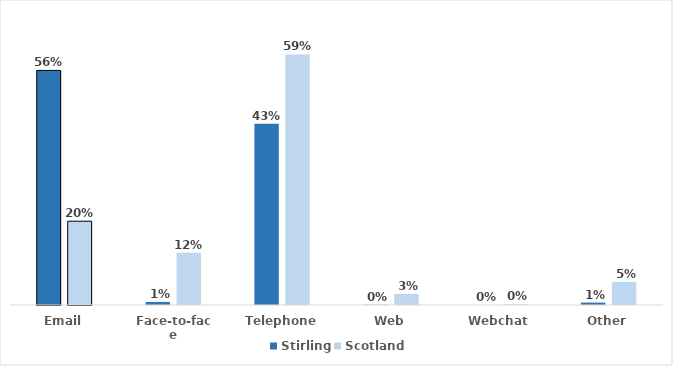
| Category | Stirling | Scotland |
|---|---|---|
| Email | 0.557 | 0.199 |
| Face-to-face | 0.007 | 0.124 |
| Telephone | 0.43 | 0.595 |
| Web | 0.001 | 0.026 |
| Webchat | 0 | 0.002 |
| Other | 0.006 | 0.055 |